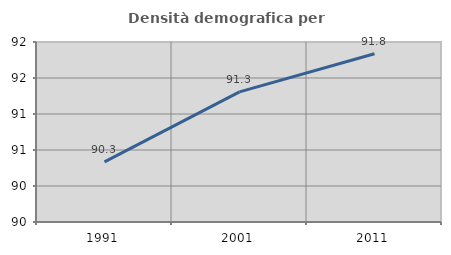
| Category | Densità demografica |
|---|---|
| 1991.0 | 90.334 |
| 2001.0 | 91.307 |
| 2011.0 | 91.837 |